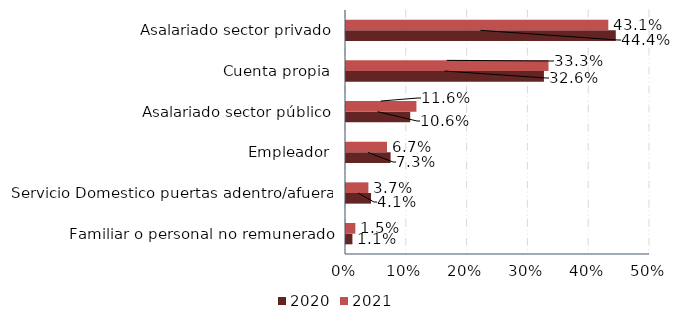
| Category | 2020 | 2021 |
|---|---|---|
| Familiar o personal no remunerado | 0.011 | 0.015 |
| Servicio Domestico puertas adentro/afuera | 0.041 | 0.037 |
| Empleador | 0.073 | 0.067 |
| Asalariado sector público | 0.106 | 0.116 |
| Cuenta propia | 0.326 | 0.333 |
| Asalariado sector privado | 0.444 | 0.431 |